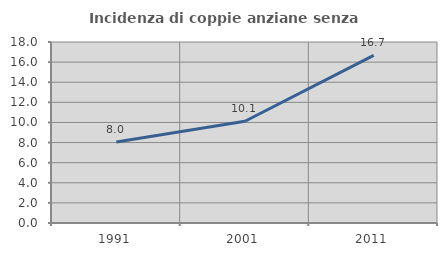
| Category | Incidenza di coppie anziane senza figli  |
|---|---|
| 1991.0 | 8.049 |
| 2001.0 | 10.116 |
| 2011.0 | 16.675 |